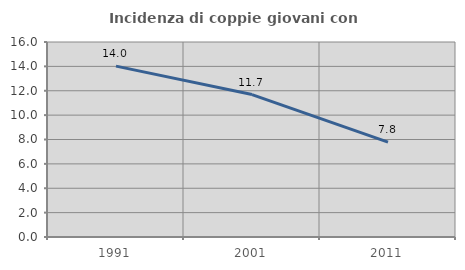
| Category | Incidenza di coppie giovani con figli |
|---|---|
| 1991.0 | 14.018 |
| 2001.0 | 11.687 |
| 2011.0 | 7.789 |